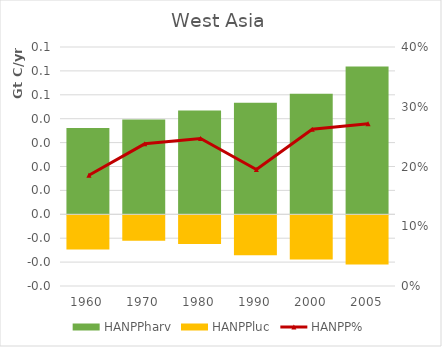
| Category | HANPPharv | HANPPluc |
|---|---|---|
| 1960.0 | 36134.279 | -14346.946 |
| 1970.0 | 39653.299 | -10636.313 |
| 1980.0 | 43380.601 | -12029.281 |
| 1990.0 | 46650.534 | -16732.451 |
| 2000.0 | 50409.326 | -18443.473 |
| 2005.0 | 61798.515 | -20575.467 |